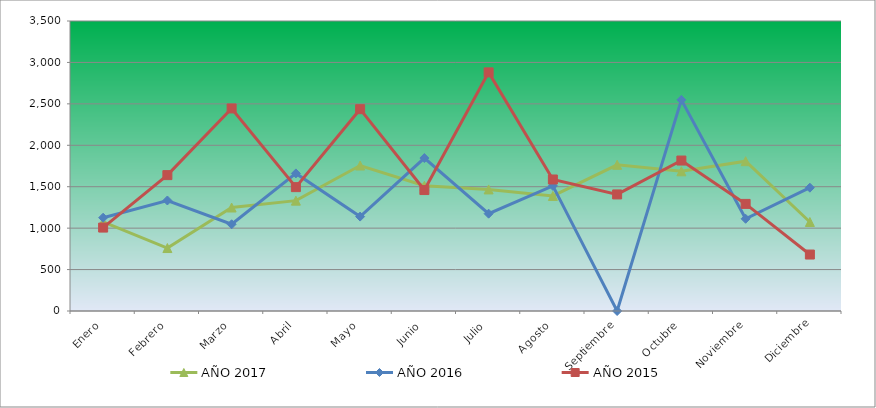
| Category | AÑO 2017 | AÑO 2016 | AÑO 2015 |
|---|---|---|---|
| Enero | 1074.359 | 1126.138 | 1006.833 |
| Febrero | 759.912 | 1333.701 | 1639.951 |
| Marzo | 1249.051 | 1046.646 | 2444.538 |
| Abril | 1332.03 | 1660.502 | 1494.861 |
| Mayo | 1755.659 | 1139.387 | 2435.745 |
| Junio | 1511.09 | 1845.984 | 1459.688 |
| Julio | 1467.417 | 1174.717 | 2879.807 |
| Agosto | 1388.805 | 1510.35 | 1587.191 |
| Septiembre | 1764.394 | 0 | 1406.928 |
| Octubre | 1685.782 | 2548.164 | 1815.817 |
| Noviembre | 1808.067 | 1112.89 | 1292.615 |
| Diciembre | 1074.359 | 1488.269 | 681.481 |